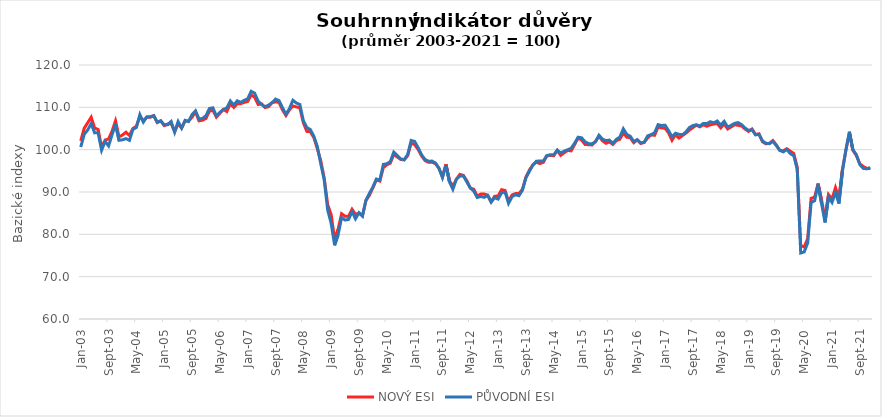
| Category | NOVÝ ESI | PŮVODNÍ ESI |
|---|---|---|
| 2003-01-01 | 102.078 | 100.617 |
| 2003-02-01 | 105.061 | 103.637 |
| 2003-03-01 | 106.356 | 104.652 |
| 2003-04-01 | 107.667 | 106.143 |
| 2003-05-01 | 105.115 | 103.968 |
| 2003-06-01 | 104.768 | 103.991 |
| 2003-07-01 | 100.536 | 99.864 |
| 2003-08-01 | 102.263 | 101.954 |
| 2003-09-01 | 102.525 | 100.878 |
| 2003-10-01 | 104.375 | 103.507 |
| 2003-11-01 | 106.796 | 106.058 |
| 2003-12-01 | 103.026 | 102.208 |
| 2004-01-01 | 103.465 | 102.323 |
| 2004-02-01 | 104.128 | 102.615 |
| 2004-03-01 | 103.342 | 102.2 |
| 2004-04-01 | 105.007 | 104.783 |
| 2004-05-01 | 105.524 | 105.251 |
| 2004-06-01 | 107.821 | 108.28 |
| 2004-07-01 | 106.827 | 106.504 |
| 2004-08-01 | 107.705 | 107.703 |
| 2004-09-01 | 107.659 | 107.795 |
| 2004-10-01 | 108.029 | 108.026 |
| 2004-11-01 | 106.395 | 106.489 |
| 2004-12-01 | 106.78 | 106.827 |
| 2005-01-01 | 105.678 | 105.866 |
| 2005-02-01 | 106.056 | 105.874 |
| 2005-03-01 | 106.156 | 106.666 |
| 2005-04-01 | 104.267 | 104.137 |
| 2005-05-01 | 106.133 | 106.643 |
| 2005-06-01 | 105.092 | 105.098 |
| 2005-07-01 | 106.75 | 106.935 |
| 2005-08-01 | 106.773 | 106.635 |
| 2005-09-01 | 107.659 | 108.303 |
| 2005-10-01 | 108.939 | 109.163 |
| 2005-11-01 | 106.819 | 107.234 |
| 2005-12-01 | 106.965 | 107.38 |
| 2006-01-01 | 107.374 | 108.018 |
| 2006-02-01 | 109.093 | 109.732 |
| 2006-03-01 | 109.34 | 109.886 |
| 2006-04-01 | 107.682 | 107.957 |
| 2006-05-01 | 108.6 | 108.825 |
| 2006-06-01 | 109.509 | 109.456 |
| 2006-07-01 | 108.993 | 109.863 |
| 2006-08-01 | 110.835 | 111.515 |
| 2006-09-01 | 109.987 | 110.532 |
| 2006-10-01 | 110.82 | 111.546 |
| 2006-11-01 | 110.859 | 111.17 |
| 2006-12-01 | 111.175 | 111.669 |
| 2007-01-01 | 111.39 | 112.023 |
| 2007-02-01 | 112.925 | 113.783 |
| 2007-03-01 | 112.393 | 113.345 |
| 2007-04-01 | 110.674 | 111.492 |
| 2007-05-01 | 110.835 | 110.639 |
| 2007-06-01 | 109.949 | 110.124 |
| 2007-07-01 | 110.134 | 110.539 |
| 2007-08-01 | 111.128 | 111.07 |
| 2007-09-01 | 111.267 | 111.946 |
| 2007-10-01 | 111.19 | 111.592 |
| 2007-11-01 | 109.417 | 109.917 |
| 2007-12-01 | 108.06 | 108.38 |
| 2008-01-01 | 109.401 | 109.671 |
| 2008-02-01 | 110.334 | 111.661 |
| 2008-03-01 | 110.088 | 111 |
| 2008-04-01 | 109.903 | 110.678 |
| 2008-05-01 | 106.372 | 106.835 |
| 2008-06-01 | 104.313 | 105.244 |
| 2008-07-01 | 104.244 | 104.759 |
| 2008-08-01 | 102.887 | 103.222 |
| 2008-09-01 | 100.312 | 100.793 |
| 2008-10-01 | 97.406 | 96.697 |
| 2008-11-01 | 93.328 | 92.862 |
| 2008-12-01 | 87.022 | 85.744 |
| 2009-01-01 | 84.647 | 82.584 |
| 2009-02-01 | 78.842 | 77.405 |
| 2009-03-01 | 81.178 | 79.909 |
| 2009-04-01 | 84.871 | 83.923 |
| 2009-05-01 | 84.277 | 83.377 |
| 2009-06-01 | 84.231 | 83.515 |
| 2009-07-01 | 85.919 | 85.337 |
| 2009-08-01 | 84.717 | 83.668 |
| 2009-09-01 | 85.017 | 85.13 |
| 2009-10-01 | 84.431 | 84.306 |
| 2009-11-01 | 87.97 | 88.073 |
| 2009-12-01 | 89.242 | 89.701 |
| 2010-01-01 | 90.992 | 91.178 |
| 2010-02-01 | 92.858 | 93.075 |
| 2010-03-01 | 92.58 | 92.808 |
| 2010-04-01 | 95.756 | 96.519 |
| 2010-05-01 | 96.411 | 96.674 |
| 2010-06-01 | 96.822 | 97.175 |
| 2010-07-01 | 98.898 | 99.421 |
| 2010-08-01 | 98.269 | 98.655 |
| 2010-09-01 | 97.691 | 97.802 |
| 2010-10-01 | 97.576 | 97.65 |
| 2010-11-01 | 98.584 | 98.831 |
| 2010-12-01 | 101.526 | 102.179 |
| 2011-01-01 | 101.193 | 101.939 |
| 2011-02-01 | 100.059 | 100.495 |
| 2011-03-01 | 98.528 | 98.784 |
| 2011-04-01 | 97.418 | 97.678 |
| 2011-05-01 | 97.02 | 97.281 |
| 2011-06-01 | 97.048 | 97.299 |
| 2011-07-01 | 96.687 | 96.848 |
| 2011-08-01 | 95.582 | 95.616 |
| 2011-09-01 | 93.588 | 93.398 |
| 2011-10-01 | 96.581 | 96.373 |
| 2011-11-01 | 92.733 | 92.407 |
| 2011-12-01 | 91.34 | 90.64 |
| 2012-01-01 | 93.015 | 93.001 |
| 2012-02-01 | 94.157 | 93.735 |
| 2012-03-01 | 93.935 | 93.836 |
| 2012-04-01 | 92.668 | 92.379 |
| 2012-05-01 | 90.947 | 90.949 |
| 2012-06-01 | 90.651 | 90.184 |
| 2012-07-01 | 89.065 | 88.694 |
| 2012-08-01 | 89.504 | 88.948 |
| 2012-09-01 | 89.523 | 88.736 |
| 2012-10-01 | 89.24 | 89.202 |
| 2012-11-01 | 87.668 | 87.624 |
| 2012-12-01 | 88.995 | 88.634 |
| 2013-01-01 | 89.065 | 88.325 |
| 2013-02-01 | 90.545 | 89.801 |
| 2013-03-01 | 90.355 | 89.981 |
| 2013-04-01 | 87.779 | 87.32 |
| 2013-05-01 | 89.296 | 88.879 |
| 2013-06-01 | 89.629 | 89.358 |
| 2013-07-01 | 89.624 | 89.123 |
| 2013-08-01 | 90.656 | 90.428 |
| 2013-09-01 | 93.542 | 93.343 |
| 2013-10-01 | 95.207 | 94.874 |
| 2013-11-01 | 96.401 | 96.377 |
| 2013-12-01 | 97.058 | 97.272 |
| 2014-01-01 | 96.715 | 97.336 |
| 2014-02-01 | 97.002 | 97.309 |
| 2014-03-01 | 98.524 | 98.595 |
| 2014-04-01 | 98.649 | 98.803 |
| 2014-05-01 | 98.575 | 98.784 |
| 2014-06-01 | 99.824 | 99.882 |
| 2014-07-01 | 98.663 | 99.232 |
| 2014-08-01 | 99.269 | 99.651 |
| 2014-09-01 | 99.828 | 99.979 |
| 2014-10-01 | 99.713 | 100.334 |
| 2014-11-01 | 101.197 | 101.547 |
| 2014-12-01 | 102.779 | 102.939 |
| 2015-01-01 | 102.275 | 102.806 |
| 2015-02-01 | 101.234 | 101.86 |
| 2015-03-01 | 101.17 | 101.427 |
| 2015-04-01 | 101.114 | 101.408 |
| 2015-05-01 | 101.961 | 101.846 |
| 2015-06-01 | 103.172 | 103.414 |
| 2015-07-01 | 102.109 | 102.501 |
| 2015-08-01 | 101.503 | 102.128 |
| 2015-09-01 | 101.831 | 102.262 |
| 2015-10-01 | 101.239 | 101.487 |
| 2015-11-01 | 102.15 | 102.441 |
| 2015-12-01 | 102.455 | 102.976 |
| 2016-01-01 | 103.95 | 104.927 |
| 2016-02-01 | 102.946 | 103.613 |
| 2016-03-01 | 102.83 | 103.165 |
| 2016-04-01 | 101.641 | 101.934 |
| 2016-05-01 | 102.307 | 102.368 |
| 2016-06-01 | 101.447 | 101.602 |
| 2016-07-01 | 101.706 | 101.768 |
| 2016-08-01 | 102.789 | 103.262 |
| 2016-09-01 | 103.492 | 103.548 |
| 2016-10-01 | 103.394 | 104.005 |
| 2016-11-01 | 105.351 | 105.909 |
| 2016-12-01 | 105.134 | 105.702 |
| 2017-01-01 | 105.041 | 105.785 |
| 2017-02-01 | 103.991 | 104.517 |
| 2017-03-01 | 102.215 | 103.022 |
| 2017-04-01 | 103.542 | 103.876 |
| 2017-05-01 | 102.733 | 103.622 |
| 2017-06-01 | 103.325 | 103.53 |
| 2017-07-01 | 103.899 | 104.194 |
| 2017-08-01 | 104.629 | 105.236 |
| 2017-09-01 | 105.217 | 105.693 |
| 2017-10-01 | 105.786 | 105.891 |
| 2017-11-01 | 105.393 | 105.591 |
| 2017-12-01 | 105.874 | 106.2 |
| 2018-01-01 | 105.531 | 106.144 |
| 2018-02-01 | 105.865 | 106.606 |
| 2018-03-01 | 106.045 | 106.334 |
| 2018-04-01 | 106.174 | 106.776 |
| 2018-05-01 | 105.152 | 105.812 |
| 2018-06-01 | 106.087 | 106.689 |
| 2018-07-01 | 104.884 | 105.314 |
| 2018-08-01 | 105.36 | 105.743 |
| 2018-09-01 | 105.897 | 106.223 |
| 2018-10-01 | 105.749 | 106.398 |
| 2018-11-01 | 105.582 | 105.909 |
| 2018-12-01 | 104.884 | 105.13 |
| 2019-01-01 | 104.306 | 104.553 |
| 2019-02-01 | 104.879 | 104.701 |
| 2019-03-01 | 103.607 | 103.488 |
| 2019-04-01 | 103.746 | 103.617 |
| 2019-05-01 | 101.877 | 102.086 |
| 2019-06-01 | 101.382 | 101.501 |
| 2019-07-01 | 101.498 | 101.422 |
| 2019-08-01 | 102.164 | 101.957 |
| 2019-09-01 | 101.109 | 100.943 |
| 2019-10-01 | 99.81 | 99.84 |
| 2019-11-01 | 99.74 | 99.476 |
| 2019-12-01 | 100.217 | 100.053 |
| 2020-01-01 | 99.648 | 99.061 |
| 2020-02-01 | 99.111 | 98.581 |
| 2020-03-01 | 95.832 | 95.349 |
| 2020-04-01 | 77.357 | 75.593 |
| 2020-05-01 | 77.006 | 75.842 |
| 2020-06-01 | 78.953 | 77.931 |
| 2020-07-01 | 88.496 | 87.537 |
| 2020-08-01 | 88.792 | 87.924 |
| 2020-09-01 | 92.02 | 91.789 |
| 2020-10-01 | 88.084 | 87.255 |
| 2020-11-01 | 83.791 | 82.801 |
| 2020-12-01 | 89.379 | 88.787 |
| 2021-01-01 | 88.315 | 87.532 |
| 2021-02-01 | 91.026 | 89.875 |
| 2021-03-01 | 88.44 | 87.251 |
| 2021-04-01 | 95.295 | 94.906 |
| 2021-05-01 | 99.851 | 99.965 |
| 2021-06-01 | 104.005 | 104.244 |
| 2021-07-01 | 99.884 | 99.988 |
| 2021-08-01 | 98.579 | 98.835 |
| 2021-09-01 | 96.706 | 96.46 |
| 2021-10-01 | 96 | 95.57 |
| 2021-11-01 | 95.582 | 95.478 |
| 2021-12-01 | 95.568 | 95.778 |